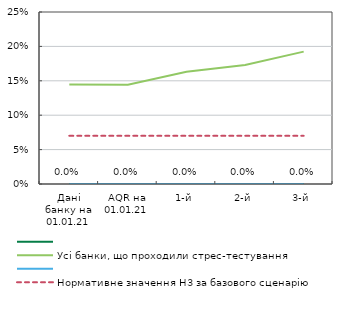
| Category | Series 0 | Усі банки, що проходили стрес-тестування | Series 3 | Нормативне значення Н3 за базового сценарію |
|---|---|---|---|---|
| Дані банку на 01.01.21 | 0 | 0.145 | 0 | 0.07 |
| AQR на 01.01.21 | 0 | 0.144 | 0 | 0.07 |
| 1-й | 0 | 0.163 | 0 | 0.07 |
| 2-й | 0 | 0.173 | 0 | 0.07 |
| 3-й | 0 | 0.192 | 0 | 0.07 |